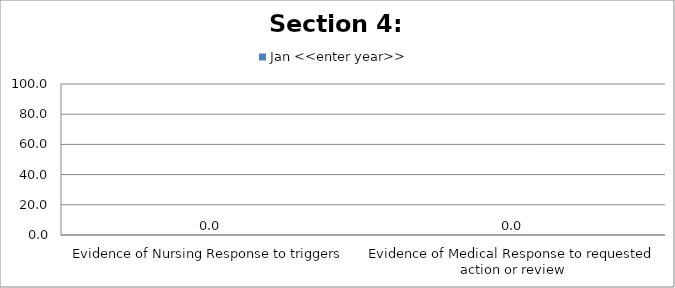
| Category | Jan <<enter year>> |
|---|---|
| Evidence of Nursing Response to triggers | 0 |
| Evidence of Medical Response to requested action or review | 0 |